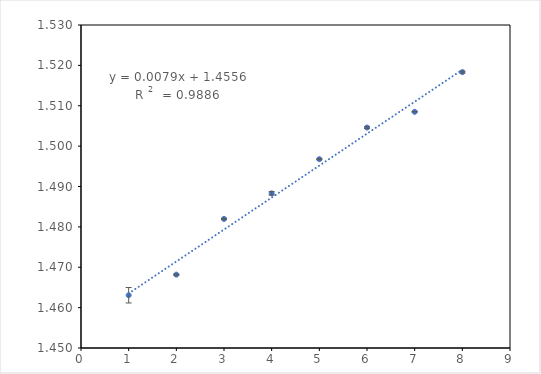
| Category | Series 0 |
|---|---|
| 0 | 1.463 |
| 1 | 1.468 |
| 2 | 1.482 |
| 3 | 1.488 |
| 4 | 1.497 |
| 5 | 1.505 |
| 6 | 1.508 |
| 7 | 1.518 |